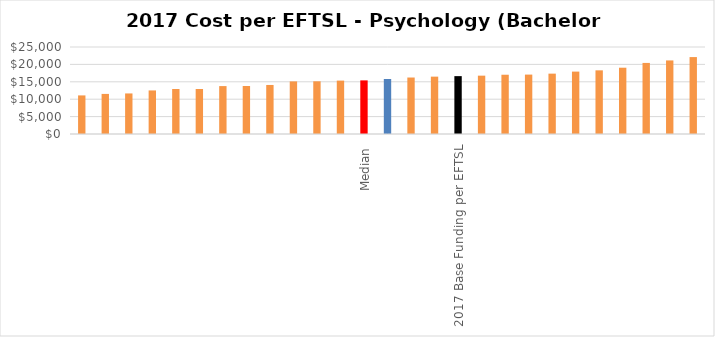
| Category | Series 0 |
|---|---|
|  | 11089.195 |
|  | 11520.011 |
|  | 11654.73 |
|  | 12519.895 |
|  | 12932.232 |
|  | 12938.281 |
|  | 13767.935 |
|  | 13799.106 |
|  | 14090.756 |
|  | 15117.676 |
|  | 15144.813 |
|  | 15344.476 |
| Median | 15407.631 |
| Mean  | 15808 |
|  | 16231.045 |
|  | 16483.872 |
| 2017 Base Funding per EFTSL | 16628.164 |